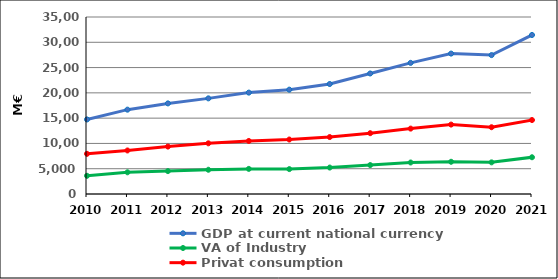
| Category | GDP at current national currency | VA of Industry | Privat consumption |
|---|---|---|---|
| 2010 | 14741.1 | 3601.153 | 7943.047 |
| 2011 | 16677.3 | 4289.79 | 8609.07 |
| 2012 | 17916.7 | 4526.9 | 9377.109 |
| 2013 | 18910.8 | 4793.883 | 10020.593 |
| 2014 | 20048.2 | 4966.476 | 10488.369 |
| 2015 | 20631.4 | 4923.32 | 10772.8 |
| 2016 | 21747.9 | 5229.8 | 11259 |
| 2017 | 23833.6 | 5719.8 | 12024.9 |
| 2018 | 25932.2 | 6230 | 12929.8 |
| 2019 | 27764.7 | 6371.8 | 13726.7 |
| 2020 | 27465 | 6256.4 | 13204.5 |
| 2021 | 31444.9 | 7265.8 | 14625.5 |